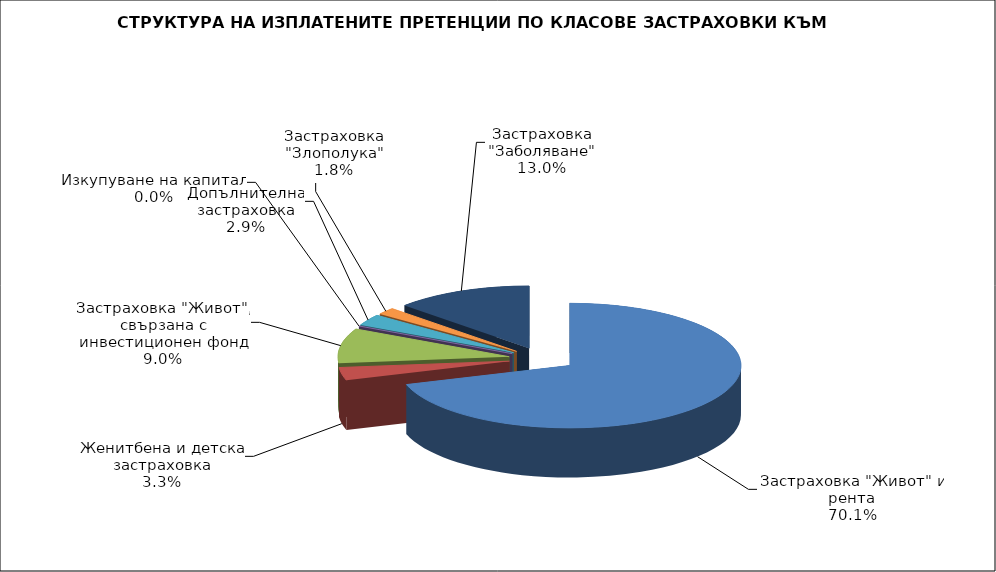
| Category | 86 782 224 |
|---|---|
| Застраховка "Живот" и рента | 86782223.807 |
| Женитбена и детска застраховка | 4097268.572 |
| Застраховка "Живот", свързана с инвестиционен фонд | 11124531.73 |
| Изкупуване на капитал | 0 |
| Допълнителна застраховка | 3625438.811 |
| Застраховка "Злополука" | 2199740.81 |
| Застраховка "Заболяване" | 16041250.404 |